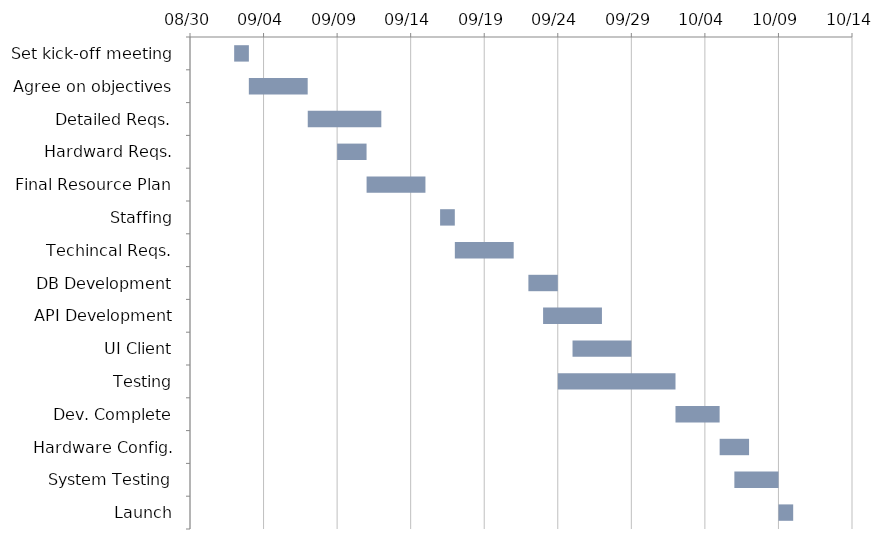
| Category | START | DAYS |
|---|---|---|
| Set kick-off meeting | 2022-09-02 | 1 |
| Agree on objectives | 2022-09-03 | 4 |
| Detailed Reqs. | 2022-09-07 | 5 |
| Hardward Reqs. | 2022-09-09 | 2 |
| Final Resource Plan | 2022-09-11 | 4 |
| Staffing | 2022-09-16 | 1 |
| Techincal Reqs. | 2022-09-17 | 4 |
| DB Development | 2022-09-22 | 2 |
| API Development | 2022-09-23 | 4 |
| UI Client | 2022-09-25 | 4 |
| Testing | 2022-09-24 | 8 |
| Dev. Complete | 2022-10-02 | 3 |
| Hardware Config. | 2022-10-05 | 2 |
| System Testing | 2022-10-06 | 3 |
| Launch | 2022-10-09 | 1 |